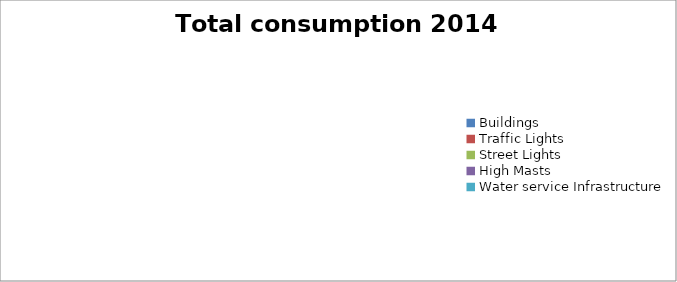
| Category | Total consumption 2014 (kWh) |
|---|---|
| Buildings | 0 |
| Traffic Lights | 0 |
| Street Lights | 0 |
| High Masts | 0 |
| Water service Infrastructure | 0 |